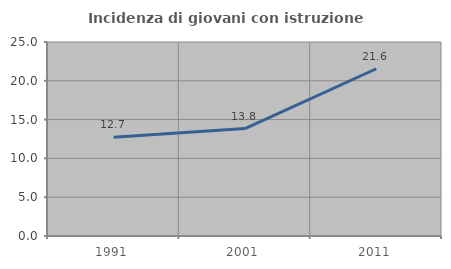
| Category | Incidenza di giovani con istruzione universitaria |
|---|---|
| 1991.0 | 12.715 |
| 2001.0 | 13.842 |
| 2011.0 | 21.552 |